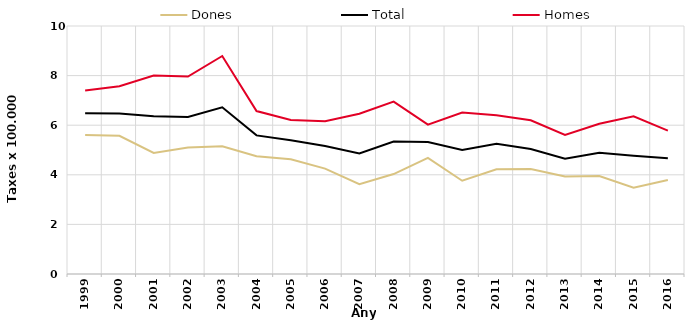
| Category | Dones | Total | Homes |
|---|---|---|---|
| 1999.0 | 5.6 | 6.48 | 7.4 |
| 2000.0 | 5.57 | 6.47 | 7.57 |
| 2001.0 | 4.88 | 6.36 | 8 |
| 2002.0 | 5.1 | 6.33 | 7.96 |
| 2003.0 | 5.15 | 6.72 | 8.79 |
| 2004.0 | 4.75 | 5.59 | 6.57 |
| 2005.0 | 4.63 | 5.39 | 6.21 |
| 2006.0 | 4.25 | 5.16 | 6.16 |
| 2007.0 | 3.62 | 4.86 | 6.46 |
| 2008.0 | 4.03 | 5.34 | 6.95 |
| 2009.0 | 4.68 | 5.32 | 6.02 |
| 2010.0 | 3.76 | 5 | 6.51 |
| 2011.0 | 4.22 | 5.25 | 6.4 |
| 2012.0 | 4.23 | 5.04 | 6.2 |
| 2013.0 | 3.93 | 4.65 | 5.61 |
| 2014.0 | 3.95 | 4.89 | 6.06 |
| 2015.0 | 3.48 | 4.77 | 6.36 |
| 2016.0 | 3.79 | 4.67 | 5.78 |